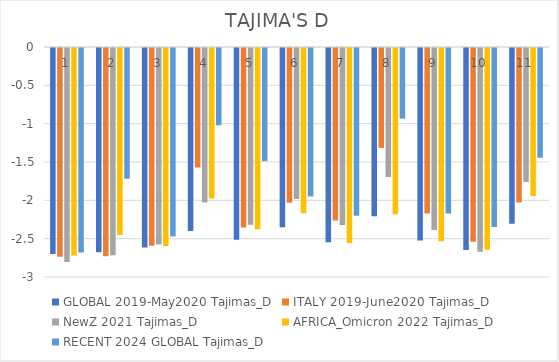
| Category | GLOBAL 2019-May2020 | ITALY 2019-June2020 | NewZ 2021 | AFRICA_Omicron 2022 | RECENT 2024 GLOBAL |
|---|---|---|---|---|---|
| 0 | -2.687 | -2.722 | -2.79 | -2.706 | -2.666 |
| 1 | -2.665 | -2.716 | -2.703 | -2.438 | -1.706 |
| 2 | -2.602 | -2.579 | -2.562 | -2.583 | -2.459 |
| 3 | -2.387 | -1.56 | -2.016 | -1.962 | -1.008 |
| 4 | -2.503 | -2.34 | -2.306 | -2.363 | -1.476 |
| 5 | -2.337 | -2.018 | -1.97 | -2.155 | -1.937 |
| 6 | -2.533 | -2.249 | -2.309 | -2.543 | -2.189 |
| 7 | -2.195 | -1.303 | -1.683 | -2.167 | -0.922 |
| 8 | -2.512 | -2.159 | -2.376 | -2.519 | -2.159 |
| 9 | -2.636 | -2.527 | -2.658 | -2.631 | -2.333 |
| 10 | -2.292 | -2.016 | -1.749 | -1.929 | -1.431 |